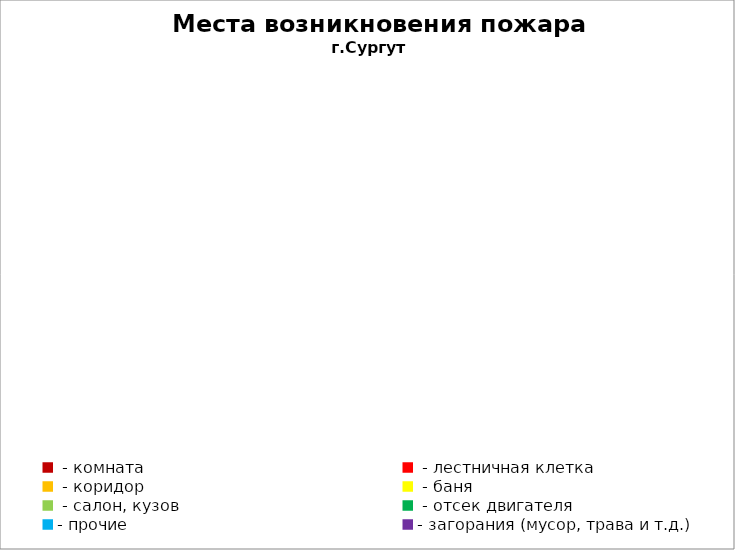
| Category | Места возникновения пожара |
|---|---|
|  - комната | 46 |
|  - лестничная клетка | 13 |
|  - коридор | 7 |
|  - баня | 18 |
|  - салон, кузов | 9 |
|  - отсек двигателя | 18 |
| - прочие | 78 |
| - загорания (мусор, трава и т.д.)  | 142 |